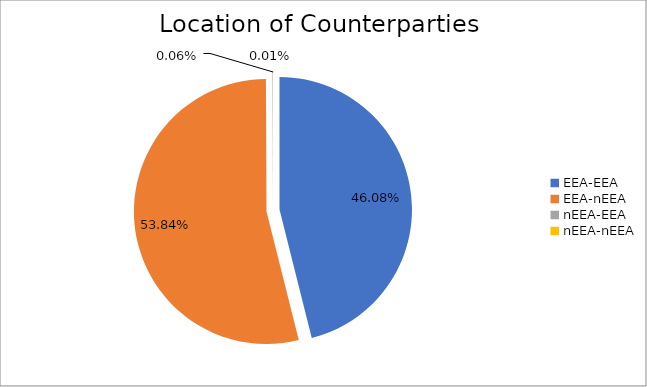
| Category | Series 0 |
|---|---|
| EEA-EEA | 6249525.062 |
| EEA-nEEA | 7301675.246 |
| nEEA-EEA | 8784.531 |
| nEEA-nEEA | 927.13 |